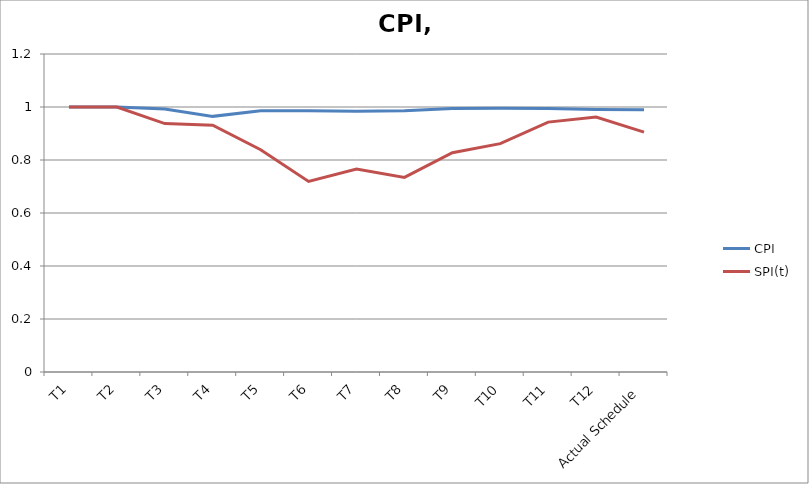
| Category | CPI | SPI(t) |
|---|---|---|
| T1 | 1 | 1 |
| T2 | 1 | 1 |
| T3 | 0.993 | 0.938 |
| T4 | 0.965 | 0.932 |
| T5 | 0.986 | 0.839 |
| T6 | 0.986 | 0.719 |
| T7 | 0.984 | 0.766 |
| T8 | 0.986 | 0.734 |
| T9 | 0.994 | 0.827 |
| T10 | 0.995 | 0.862 |
| T11 | 0.995 | 0.943 |
| T12 | 0.991 | 0.962 |
| Actual Schedule | 0.99 | 0.905 |